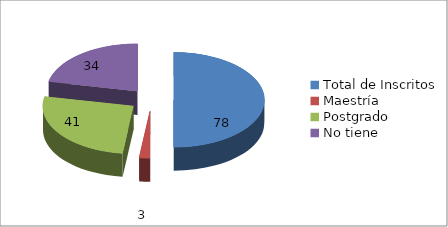
| Category | Sede Santiago |
|---|---|
| Total de Inscritos | 78 |
| Maestría | 3 |
| Postgrado | 41 |
| No tiene | 34 |